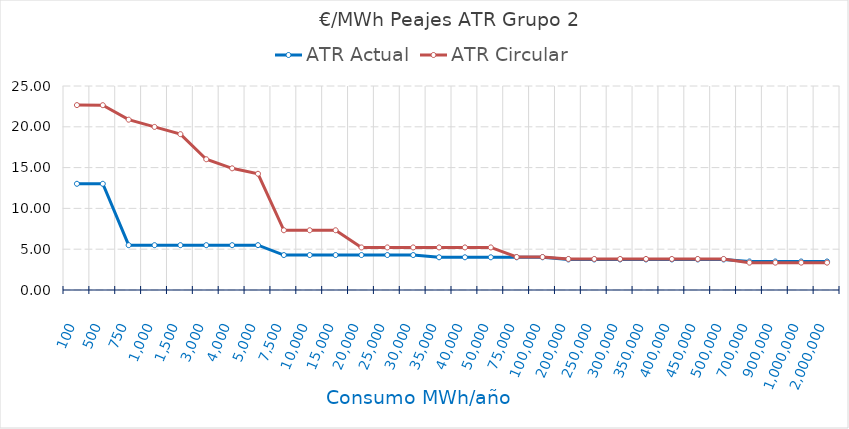
| Category | ATR Actual | ATR Circular |
|---|---|---|
| 100.0 | 13.016 | 22.659 |
| 500.0 | 13.016 | 22.649 |
| 750.0 | 5.494 | 20.873 |
| 1000.0 | 5.494 | 19.986 |
| 1500.0 | 5.494 | 19.098 |
| 3000.0 | 5.494 | 16.023 |
| 4000.0 | 5.494 | 14.912 |
| 5000.0 | 5.494 | 14.245 |
| 7500.0 | 4.283 | 7.322 |
| 10000.0 | 4.283 | 7.322 |
| 15000.0 | 4.283 | 7.322 |
| 20000.0 | 4.283 | 5.216 |
| 25000.0 | 4.283 | 5.216 |
| 30000.0 | 4.283 | 5.216 |
| 35000.0 | 4.009 | 5.216 |
| 40000.0 | 4.009 | 5.216 |
| 50000.0 | 4.009 | 5.216 |
| 75000.0 | 4.009 | 4.042 |
| 100000.0 | 4.009 | 4.042 |
| 200000.0 | 3.743 | 3.803 |
| 250000.0 | 3.743 | 3.803 |
| 300000.0 | 3.743 | 3.803 |
| 350000.0 | 3.743 | 3.803 |
| 400000.0 | 3.743 | 3.803 |
| 450000.0 | 3.743 | 3.803 |
| 500000.0 | 3.743 | 3.803 |
| 700000.0 | 3.494 | 3.351 |
| 900000.0 | 3.494 | 3.351 |
| 1000000.0 | 3.494 | 3.351 |
| 2000000.0 | 3.494 | 3.351 |